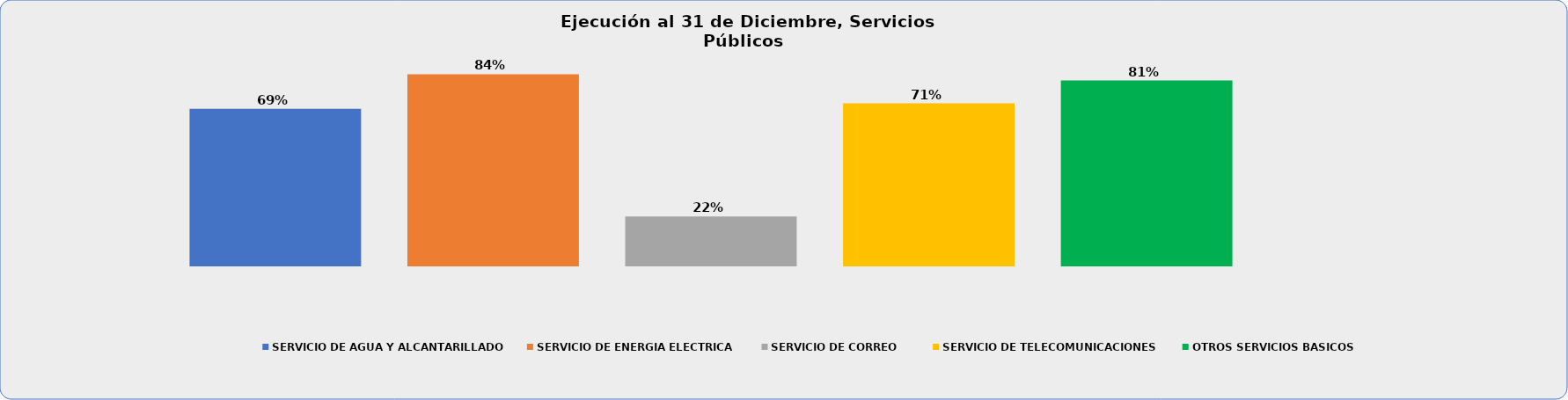
| Category | SERVICIO DE AGUA Y ALCANTARILLADO | SERVICIO DE ENERGIA ELECTRICA | SERVICIO DE CORREO | SERVICIO DE TELECOMUNICACIONES | OTROS SERVICIOS BASICOS |
|---|---|---|---|---|---|
| 0 | 0.689 | 0.841 | 0.218 | 0.713 | 0.813 |